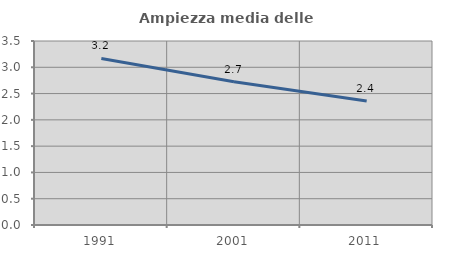
| Category | Ampiezza media delle famiglie |
|---|---|
| 1991.0 | 3.168 |
| 2001.0 | 2.727 |
| 2011.0 | 2.358 |